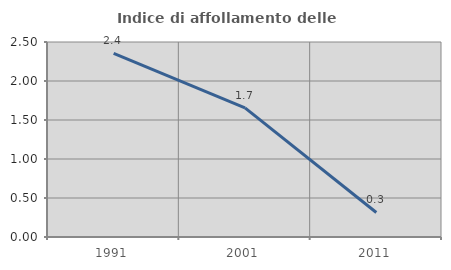
| Category | Indice di affollamento delle abitazioni  |
|---|---|
| 1991.0 | 2.353 |
| 2001.0 | 1.655 |
| 2011.0 | 0.314 |